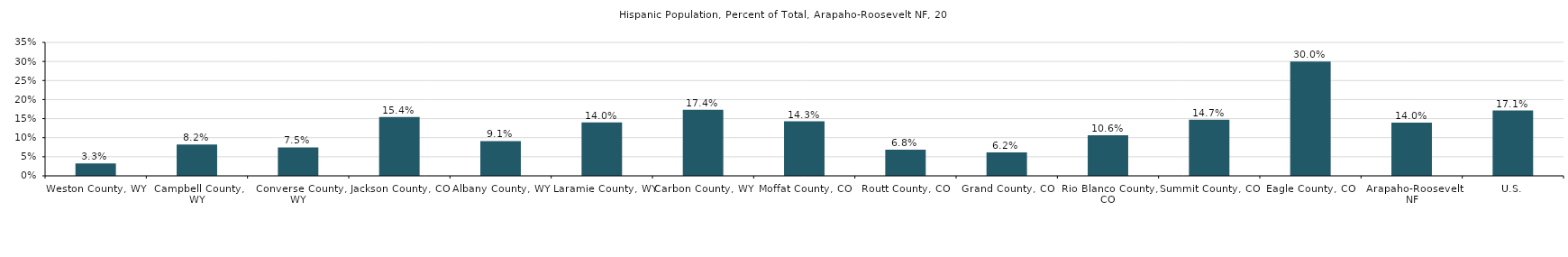
| Category | Hispanic or Latino (of any race) |
|---|---|
| Gallatin County, MT | 0.028 |
| County Region | 0.028 |
| U.S. | 0.157 |